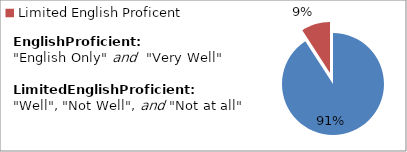
| Category | Percent |
|---|---|
| English Proficient | 0.909 |
| Limited English Proficent | 0.091 |